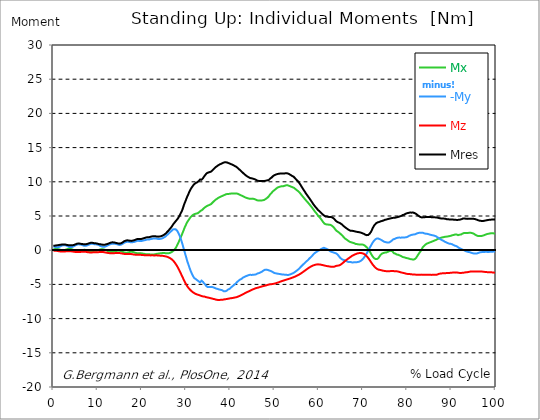
| Category |  Mx |  -My |  Mz |  Mres |
|---|---|---|---|---|
| 0.0 | 0.11 | 0.56 | -0.1 | 0.65 |
| 0.167348456675344 | 0.14 | 0.52 | -0.09 | 0.66 |
| 0.334696913350688 | 0.17 | 0.49 | -0.08 | 0.67 |
| 0.5020453700260321 | 0.18 | 0.46 | -0.09 | 0.69 |
| 0.669393826701376 | 0.18 | 0.43 | -0.09 | 0.7 |
| 0.83674228337672 | 0.19 | 0.42 | -0.1 | 0.7 |
| 1.0040907400520642 | 0.17 | 0.44 | -0.12 | 0.73 |
| 1.1621420602454444 | 0.15 | 0.46 | -0.14 | 0.76 |
| 1.3294905169207885 | 0.12 | 0.49 | -0.16 | 0.77 |
| 1.4968389735961325 | 0.08 | 0.55 | -0.18 | 0.78 |
| 1.6641874302714765 | 0.04 | 0.6 | -0.19 | 0.8 |
| 1.8315358869468206 | 0.01 | 0.65 | -0.2 | 0.82 |
| 1.9988843436221646 | -0.02 | 0.69 | -0.2 | 0.84 |
| 2.1662328002975086 | -0.02 | 0.71 | -0.2 | 0.85 |
| 2.333581256972853 | -0.01 | 0.73 | -0.2 | 0.85 |
| 2.5009297136481967 | 0.02 | 0.72 | -0.19 | 0.84 |
| 2.6682781703235405 | 0.05 | 0.72 | -0.18 | 0.83 |
| 2.8356266269988843 | 0.08 | 0.7 | -0.17 | 0.81 |
| 3.002975083674229 | 0.12 | 0.66 | -0.16 | 0.78 |
| 3.1703235403495724 | 0.16 | 0.62 | -0.15 | 0.76 |
| 3.337671997024917 | 0.19 | 0.55 | -0.15 | 0.74 |
| 3.4957233172182973 | 0.21 | 0.5 | -0.14 | 0.74 |
| 3.663071773893641 | 0.21 | 0.46 | -0.15 | 0.73 |
| 3.8304202305689854 | 0.2 | 0.44 | -0.15 | 0.72 |
| 3.997768687244329 | 0.17 | 0.45 | -0.16 | 0.72 |
| 4.165117143919673 | 0.14 | 0.47 | -0.18 | 0.72 |
| 4.332465600595017 | 0.1 | 0.49 | -0.19 | 0.73 |
| 4.499814057270361 | 0.05 | 0.54 | -0.21 | 0.75 |
| 4.667162513945706 | 0 | 0.59 | -0.23 | 0.77 |
| 4.834510970621049 | -0.06 | 0.65 | -0.24 | 0.82 |
| 5.001859427296393 | -0.11 | 0.72 | -0.26 | 0.86 |
| 5.169207883971737 | -0.14 | 0.76 | -0.27 | 0.91 |
| 5.336556340647081 | -0.16 | 0.81 | -0.28 | 0.95 |
| 5.503904797322425 | -0.17 | 0.84 | -0.28 | 0.97 |
| 5.671253253997769 | -0.16 | 0.86 | -0.27 | 0.98 |
| 5.82930457419115 | -0.13 | 0.85 | -0.27 | 0.97 |
| 5.996653030866494 | -0.1 | 0.84 | -0.26 | 0.96 |
| 6.164001487541838 | -0.07 | 0.82 | -0.25 | 0.94 |
| 6.331349944217181 | -0.03 | 0.8 | -0.24 | 0.92 |
| 6.498698400892526 | 0 | 0.76 | -0.23 | 0.9 |
| 6.66604685756787 | 0.03 | 0.71 | -0.22 | 0.89 |
| 6.833395314243213 | 0.05 | 0.67 | -0.22 | 0.87 |
| 7.000743770918558 | 0.06 | 0.64 | -0.22 | 0.85 |
| 7.168092227593902 | 0.06 | 0.63 | -0.23 | 0.85 |
| 7.335440684269246 | 0.04 | 0.64 | -0.24 | 0.87 |
| 7.50278914094459 | 0 | 0.67 | -0.26 | 0.89 |
| 7.6701375976199335 | -0.05 | 0.71 | -0.28 | 0.92 |
| 7.837486054295278 | -0.1 | 0.75 | -0.29 | 0.95 |
| 7.995537374488658 | -0.14 | 0.8 | -0.31 | 0.99 |
| 8.162885831164003 | -0.18 | 0.86 | -0.32 | 1.03 |
| 8.330234287839346 | -0.21 | 0.9 | -0.33 | 1.07 |
| 8.49758274451469 | -0.21 | 0.93 | -0.33 | 1.09 |
| 8.664931201190035 | -0.19 | 0.94 | -0.33 | 1.09 |
| 8.832279657865378 | -0.17 | 0.94 | -0.32 | 1.09 |
| 8.999628114540721 | -0.14 | 0.92 | -0.31 | 1.06 |
| 9.166976571216066 | -0.1 | 0.89 | -0.3 | 1.03 |
| 9.334325027891412 | -0.08 | 0.86 | -0.3 | 1 |
| 9.501673484566755 | -0.1 | 0.86 | -0.31 | 1 |
| 9.669021941242098 | -0.1 | 0.86 | -0.31 | 1 |
| 9.836370397917442 | -0.06 | 0.84 | -0.3 | 0.97 |
| 10.003718854592787 | -0.03 | 0.81 | -0.29 | 0.95 |
| 10.17106731126813 | 0.01 | 0.77 | -0.29 | 0.92 |
| 10.329118631461512 | 0.05 | 0.73 | -0.28 | 0.89 |
| 10.496467088136853 | 0.09 | 0.67 | -0.27 | 0.87 |
| 10.663815544812199 | 0.12 | 0.61 | -0.26 | 0.86 |
| 10.831164001487544 | 0.12 | 0.57 | -0.27 | 0.84 |
| 10.998512458162887 | 0.13 | 0.53 | -0.27 | 0.82 |
| 11.16586091483823 | 0.13 | 0.5 | -0.27 | 0.81 |
| 11.333209371513574 | 0.12 | 0.49 | -0.28 | 0.8 |
| 11.50055782818892 | 0.09 | 0.49 | -0.3 | 0.8 |
| 11.667906284864264 | 0.05 | 0.52 | -0.32 | 0.81 |
| 11.835254741539607 | 0.01 | 0.56 | -0.34 | 0.84 |
| 12.00260319821495 | -0.03 | 0.6 | -0.36 | 0.87 |
| 12.169951654890292 | -0.08 | 0.65 | -0.38 | 0.9 |
| 12.337300111565641 | -0.14 | 0.71 | -0.4 | 0.93 |
| 12.504648568240984 | -0.2 | 0.77 | -0.42 | 0.98 |
| 12.662699888434362 | -0.24 | 0.83 | -0.43 | 1.03 |
| 12.830048345109708 | -0.26 | 0.87 | -0.44 | 1.07 |
| 12.997396801785053 | -0.28 | 0.91 | -0.45 | 1.11 |
| 13.164745258460396 | -0.28 | 0.94 | -0.45 | 1.14 |
| 13.33209371513574 | -0.28 | 0.95 | -0.45 | 1.15 |
| 13.499442171811083 | -0.26 | 0.96 | -0.45 | 1.15 |
| 13.666790628486426 | -0.23 | 0.95 | -0.44 | 1.14 |
| 13.834139085161771 | -0.2 | 0.94 | -0.43 | 1.12 |
| 14.001487541837117 | -0.17 | 0.93 | -0.42 | 1.09 |
| 14.16883599851246 | -0.13 | 0.91 | -0.41 | 1.07 |
| 14.336184455187803 | -0.11 | 0.88 | -0.4 | 1.04 |
| 14.503532911863147 | -0.09 | 0.85 | -0.4 | 1.01 |
| 14.670881368538492 | -0.08 | 0.81 | -0.4 | 0.98 |
| 14.828932688731873 | -0.08 | 0.78 | -0.41 | 0.97 |
| 14.996281145407215 | -0.09 | 0.77 | -0.42 | 0.96 |
| 15.163629602082558 | -0.11 | 0.78 | -0.43 | 0.98 |
| 15.330978058757903 | -0.14 | 0.82 | -0.45 | 1.02 |
| 15.498326515433247 | -0.18 | 0.87 | -0.48 | 1.07 |
| 15.665674972108594 | -0.24 | 0.94 | -0.5 | 1.14 |
| 15.833023428783937 | -0.29 | 1.01 | -0.52 | 1.23 |
| 16.00037188545928 | -0.33 | 1.08 | -0.54 | 1.3 |
| 16.167720342134626 | -0.35 | 1.13 | -0.55 | 1.35 |
| 16.335068798809967 | -0.36 | 1.17 | -0.56 | 1.39 |
| 16.502417255485312 | -0.37 | 1.2 | -0.56 | 1.42 |
| 16.669765712160658 | -0.36 | 1.22 | -0.56 | 1.44 |
| 16.837114168836 | -0.34 | 1.23 | -0.56 | 1.44 |
| 17.004462625511344 | -0.31 | 1.22 | -0.56 | 1.43 |
| 17.16251394570472 | -0.28 | 1.21 | -0.56 | 1.41 |
| 17.32986240238007 | -0.25 | 1.18 | -0.56 | 1.38 |
| 17.497210859055414 | -0.23 | 1.15 | -0.56 | 1.35 |
| 17.664559315730756 | -0.22 | 1.16 | -0.57 | 1.36 |
| 17.8319077724061 | -0.24 | 1.17 | -0.59 | 1.38 |
| 17.999256229081443 | -0.26 | 1.18 | -0.61 | 1.41 |
| 18.166604685756788 | -0.29 | 1.2 | -0.62 | 1.43 |
| 18.333953142432133 | -0.33 | 1.22 | -0.64 | 1.47 |
| 18.501301599107478 | -0.38 | 1.26 | -0.66 | 1.52 |
| 18.668650055782823 | -0.41 | 1.3 | -0.67 | 1.56 |
| 18.835998512458165 | -0.44 | 1.34 | -0.67 | 1.61 |
| 19.00334696913351 | -0.45 | 1.37 | -0.67 | 1.64 |
| 19.170695425808855 | -0.44 | 1.38 | -0.67 | 1.65 |
| 19.338043882484197 | -0.43 | 1.36 | -0.67 | 1.63 |
| 19.496095202677576 | -0.43 | 1.36 | -0.67 | 1.63 |
| 19.66344365935292 | -0.43 | 1.34 | -0.67 | 1.62 |
| 19.830792116028263 | -0.44 | 1.33 | -0.68 | 1.61 |
| 19.998140572703612 | -0.48 | 1.36 | -0.7 | 1.66 |
| 20.165489029378953 | -0.5 | 1.4 | -0.71 | 1.7 |
| 20.3328374860543 | -0.51 | 1.42 | -0.71 | 1.73 |
| 20.500185942729644 | -0.51 | 1.42 | -0.72 | 1.74 |
| 20.667534399404985 | -0.55 | 1.46 | -0.74 | 1.79 |
| 20.83488285608033 | -0.58 | 1.5 | -0.74 | 1.84 |
| 21.002231312755672 | -0.6 | 1.53 | -0.75 | 1.87 |
| 21.16957976943102 | -0.6 | 1.56 | -0.75 | 1.89 |
| 21.336928226106362 | -0.59 | 1.57 | -0.75 | 1.9 |
| 21.504276682781704 | -0.58 | 1.57 | -0.75 | 1.89 |
| 21.67162513945705 | -0.59 | 1.57 | -0.75 | 1.9 |
| 21.82967645965043 | -0.61 | 1.6 | -0.76 | 1.93 |
| 21.997024916325774 | -0.63 | 1.63 | -0.76 | 1.97 |
| 22.16437337300112 | -0.63 | 1.65 | -0.76 | 2 |
| 22.33172182967646 | -0.63 | 1.67 | -0.75 | 2.02 |
| 22.499070286351806 | -0.63 | 1.69 | -0.75 | 2.03 |
| 22.666418743027148 | -0.62 | 1.71 | -0.76 | 2.04 |
| 22.833767199702496 | -0.61 | 1.73 | -0.76 | 2.06 |
| 23.00111565637784 | -0.6 | 1.72 | -0.76 | 2.05 |
| 23.168464113053183 | -0.59 | 1.72 | -0.76 | 2.04 |
| 23.335812569728528 | -0.54 | 1.69 | -0.75 | 2 |
| 23.50316102640387 | -0.52 | 1.66 | -0.76 | 1.97 |
| 23.670509483079215 | -0.51 | 1.64 | -0.78 | 1.98 |
| 23.83785793975456 | -0.49 | 1.64 | -0.79 | 1.99 |
| 23.995909259947936 | -0.47 | 1.64 | -0.79 | 2 |
| 24.163257716623285 | -0.45 | 1.65 | -0.8 | 2.01 |
| 24.330606173298627 | -0.44 | 1.67 | -0.81 | 2.04 |
| 24.49795462997397 | -0.43 | 1.71 | -0.82 | 2.08 |
| 24.665303086649313 | -0.42 | 1.75 | -0.82 | 2.12 |
| 24.83265154332466 | -0.42 | 1.8 | -0.84 | 2.18 |
| 25.0 | -0.42 | 1.86 | -0.85 | 2.24 |
| 25.167348456675345 | -0.43 | 1.92 | -0.87 | 2.31 |
| 25.334696913350694 | -0.43 | 2 | -0.9 | 2.4 |
| 25.502045370026035 | -0.44 | 2.09 | -0.93 | 2.5 |
| 25.669393826701377 | -0.45 | 2.2 | -0.95 | 2.62 |
| 25.836742283376722 | -0.45 | 2.29 | -0.99 | 2.72 |
| 26.004090740052067 | -0.45 | 2.39 | -1.03 | 2.84 |
| 26.17143919672741 | -0.43 | 2.49 | -1.09 | 2.95 |
| 26.329490516920792 | -0.41 | 2.61 | -1.14 | 3.1 |
| 26.49683897359613 | -0.36 | 2.71 | -1.2 | 3.22 |
| 26.66418743027148 | -0.3 | 2.79 | -1.28 | 3.36 |
| 26.831535886946828 | -0.23 | 2.91 | -1.37 | 3.52 |
| 26.998884343622166 | -0.16 | 3.02 | -1.47 | 3.69 |
| 27.166232800297514 | -0.07 | 3.08 | -1.59 | 3.85 |
| 27.333581256972852 | 0.05 | 3.08 | -1.71 | 3.97 |
| 27.5009297136482 | 0.18 | 3.07 | -1.85 | 4.11 |
| 27.668278170323543 | 0.33 | 3.05 | -2.01 | 4.25 |
| 27.835626626998888 | 0.51 | 2.97 | -2.18 | 4.38 |
| 28.002975083674233 | 0.73 | 2.83 | -2.36 | 4.52 |
| 28.170323540349575 | 0.95 | 2.65 | -2.55 | 4.64 |
| 28.33767199702492 | 1.19 | 2.42 | -2.75 | 4.82 |
| 28.50502045370026 | 1.43 | 2.2 | -2.96 | 5.02 |
| 28.663071773893645 | 1.69 | 1.9 | -3.19 | 5.24 |
| 28.830420230568986 | 1.94 | 1.61 | -3.42 | 5.46 |
| 28.99776868724433 | 2.19 | 1.28 | -3.65 | 5.64 |
| 29.165117143919673 | 2.46 | 0.93 | -3.88 | 5.9 |
| 29.33246560059502 | 2.72 | 0.54 | -4.11 | 6.23 |
| 29.499814057270367 | 3 | 0.16 | -4.34 | 6.56 |
| 29.66716251394571 | 3.28 | -0.23 | -4.56 | 6.86 |
| 29.834510970621054 | 3.52 | -0.6 | -4.77 | 7.11 |
| 30.00185942729639 | 3.75 | -0.96 | -4.97 | 7.39 |
| 30.169207883971744 | 3.98 | -1.36 | -5.16 | 7.68 |
| 30.33655634064708 | 4.18 | -1.72 | -5.32 | 7.93 |
| 30.50390479732243 | 4.33 | -2.02 | -5.47 | 8.16 |
| 30.671253253997772 | 4.49 | -2.33 | -5.61 | 8.42 |
| 30.829304574191156 | 4.65 | -2.66 | -5.73 | 8.65 |
| 30.996653030866494 | 4.81 | -2.96 | -5.84 | 8.87 |
| 31.164001487541842 | 4.93 | -3.22 | -5.94 | 9.05 |
| 31.331349944217187 | 5.03 | -3.45 | -6.03 | 9.21 |
| 31.498698400892525 | 5.12 | -3.68 | -6.12 | 9.37 |
| 31.666046857567874 | 5.2 | -3.88 | -6.2 | 9.51 |
| 31.833395314243212 | 5.26 | -4.05 | -6.27 | 9.65 |
| 32.00074377091856 | 5.3 | -4.1 | -6.34 | 9.73 |
| 32.1680922275939 | 5.35 | -4.21 | -6.39 | 9.81 |
| 32.33544068426925 | 5.36 | -4.3 | -6.43 | 9.86 |
| 32.50278914094459 | 5.38 | -4.38 | -6.47 | 9.92 |
| 32.670137597619934 | 5.41 | -4.45 | -6.5 | 9.99 |
| 32.83748605429528 | 5.49 | -4.54 | -6.54 | 10.09 |
| 33.004834510970625 | 5.59 | -4.62 | -6.57 | 10.2 |
| 33.162885831164004 | 5.71 | -4.7 | -6.61 | 10.33 |
| 33.33023428783935 | 5.77 | -4.56 | -6.65 | 10.31 |
| 33.497582744514695 | 5.82 | -4.45 | -6.7 | 10.31 |
| 33.664931201190036 | 5.89 | -4.45 | -6.74 | 10.37 |
| 33.83227965786538 | 6 | -4.63 | -6.76 | 10.53 |
| 33.99962811454073 | 6.12 | -4.78 | -6.77 | 10.7 |
| 34.16697657121607 | 6.22 | -4.9 | -6.78 | 10.84 |
| 34.33432502789141 | 6.29 | -5.01 | -6.83 | 10.98 |
| 34.50167348456676 | 6.36 | -5.17 | -6.86 | 11.12 |
| 34.6690219412421 | 6.44 | -5.31 | -6.89 | 11.25 |
| 34.83637039791744 | 6.51 | -5.38 | -6.91 | 11.33 |
| 35.00371885459279 | 6.54 | -5.38 | -6.93 | 11.35 |
| 35.17106731126814 | 6.59 | -5.38 | -6.95 | 11.39 |
| 35.338415767943474 | 6.64 | -5.38 | -6.98 | 11.42 |
| 35.49646708813686 | 6.68 | -5.38 | -7.01 | 11.45 |
| 35.6638155448122 | 6.75 | -5.36 | -7.03 | 11.5 |
| 35.831164001487544 | 6.86 | -5.36 | -7.06 | 11.58 |
| 35.998512458162885 | 6.97 | -5.41 | -7.09 | 11.69 |
| 36.165860914838234 | 7.07 | -5.43 | -7.12 | 11.79 |
| 36.333209371513576 | 7.18 | -5.5 | -7.14 | 11.92 |
| 36.50055782818892 | 7.28 | -5.53 | -7.17 | 12.02 |
| 36.667906284864266 | 7.37 | -5.58 | -7.21 | 12.13 |
| 36.83525474153961 | 7.44 | -5.61 | -7.24 | 12.21 |
| 37.002603198214956 | 7.51 | -5.63 | -7.26 | 12.28 |
| 37.1699516548903 | 7.6 | -5.67 | -7.27 | 12.37 |
| 37.337300111565646 | 7.67 | -5.7 | -7.28 | 12.44 |
| 37.50464856824098 | 7.73 | -5.74 | -7.27 | 12.51 |
| 37.66269988843437 | 7.78 | -5.76 | -7.27 | 12.56 |
| 37.83004834510971 | 7.83 | -5.79 | -7.26 | 12.61 |
| 37.99739680178505 | 7.88 | -5.82 | -7.25 | 12.65 |
| 38.16474525846039 | 7.93 | -5.85 | -7.25 | 12.7 |
| 38.33209371513574 | 7.97 | -5.94 | -7.22 | 12.76 |
| 38.49944217181109 | 8.01 | -5.99 | -7.21 | 12.8 |
| 38.666790628486424 | 8.07 | -6.01 | -7.19 | 12.84 |
| 38.83413908516178 | 8.12 | -6.01 | -7.17 | 12.86 |
| 39.001487541837115 | 8.17 | -5.98 | -7.16 | 12.86 |
| 39.16883599851246 | 8.2 | -5.93 | -7.14 | 12.85 |
| 39.336184455187805 | 8.22 | -5.85 | -7.12 | 12.81 |
| 39.503532911863154 | 8.24 | -5.75 | -7.1 | 12.76 |
| 39.670881368538495 | 8.23 | -5.72 | -7.07 | 12.72 |
| 39.83822982521384 | 8.25 | -5.66 | -7.05 | 12.69 |
| 39.996281145407224 | 8.26 | -5.55 | -7.03 | 12.63 |
| 40.163629602082565 | 8.28 | -5.45 | -7.02 | 12.58 |
| 40.33097805875791 | 8.3 | -5.36 | -7.01 | 12.54 |
| 40.498326515433256 | 8.31 | -5.27 | -6.99 | 12.5 |
| 40.6656749721086 | 8.3 | -5.19 | -6.97 | 12.44 |
| 40.83302342878393 | 8.3 | -5.1 | -6.95 | 12.38 |
| 41.00037188545929 | 8.29 | -5 | -6.93 | 12.32 |
| 41.16772034213463 | 8.3 | -4.91 | -6.9 | 12.27 |
| 41.33506879880997 | 8.29 | -4.8 | -6.88 | 12.2 |
| 41.50241725548531 | 8.28 | -4.68 | -6.85 | 12.12 |
| 41.66976571216066 | 8.26 | -4.58 | -6.81 | 12.04 |
| 41.837114168836 | 8.21 | -4.48 | -6.76 | 11.94 |
| 42.004462625511344 | 8.16 | -4.39 | -6.71 | 11.83 |
| 42.17181108218669 | 8.1 | -4.32 | -6.67 | 11.74 |
| 42.32986240238007 | 8.05 | -4.26 | -6.62 | 11.64 |
| 42.497210859055414 | 8 | -4.21 | -6.57 | 11.55 |
| 42.66455931573076 | 7.95 | -4.1 | -6.51 | 11.43 |
| 42.831907772406105 | 7.9 | -4.03 | -6.45 | 11.33 |
| 42.999256229081446 | 7.85 | -3.96 | -6.38 | 11.23 |
| 43.16660468575679 | 7.79 | -3.92 | -6.34 | 11.14 |
| 43.33395314243214 | 7.73 | -3.86 | -6.28 | 11.04 |
| 43.50130159910748 | 7.69 | -3.8 | -6.22 | 10.95 |
| 43.66865005578282 | 7.65 | -3.75 | -6.16 | 10.86 |
| 43.83599851245817 | 7.61 | -3.73 | -6.11 | 10.79 |
| 44.00334696913351 | 7.58 | -3.69 | -6.06 | 10.73 |
| 44.17069542580886 | 7.57 | -3.64 | -6.02 | 10.67 |
| 44.3380438824842 | 7.53 | -3.6 | -5.96 | 10.6 |
| 44.49609520267758 | 7.51 | -3.59 | -5.91 | 10.54 |
| 44.66344365935292 | 7.53 | -3.59 | -5.86 | 10.52 |
| 44.83079211602827 | 7.55 | -3.62 | -5.81 | 10.52 |
| 44.99814057270361 | 7.54 | -3.62 | -5.76 | 10.49 |
| 45.16548902937895 | 7.54 | -3.58 | -5.71 | 10.46 |
| 45.332837486054295 | 7.5 | -3.58 | -5.67 | 10.42 |
| 45.500185942729644 | 7.45 | -3.57 | -5.63 | 10.38 |
| 45.66753439940499 | 7.42 | -3.56 | -5.58 | 10.34 |
| 45.83488285608033 | 7.37 | -3.53 | -5.54 | 10.28 |
| 46.00223131275568 | 7.31 | -3.46 | -5.51 | 10.21 |
| 46.16957976943102 | 7.27 | -3.4 | -5.49 | 10.16 |
| 46.336928226106366 | 7.26 | -3.38 | -5.46 | 10.14 |
| 46.50427668278171 | 7.26 | -3.35 | -5.43 | 10.13 |
| 46.671625139457056 | 7.25 | -3.29 | -5.4 | 10.11 |
| 46.829676459650436 | 7.26 | -3.25 | -5.36 | 10.11 |
| 46.99702491632577 | 7.27 | -3.22 | -5.32 | 10.11 |
| 47.16437337300112 | 7.28 | -3.14 | -5.29 | 10.1 |
| 47.33172182967646 | 7.29 | -3.05 | -5.26 | 10.1 |
| 47.49907028635181 | 7.31 | -2.98 | -5.24 | 10.1 |
| 47.66641874302716 | 7.35 | -2.91 | -5.22 | 10.11 |
| 47.83376719970249 | 7.41 | -2.86 | -5.19 | 10.14 |
| 48.001115656377834 | 7.48 | -2.85 | -5.16 | 10.16 |
| 48.16846411305319 | 7.56 | -2.84 | -5.13 | 10.18 |
| 48.33581256972853 | 7.64 | -2.85 | -5.1 | 10.21 |
| 48.50316102640387 | 7.74 | -2.89 | -5.06 | 10.21 |
| 48.67050948307921 | 7.84 | -2.94 | -5.01 | 10.24 |
| 48.837857939754564 | 7.99 | -2.97 | -5 | 10.34 |
| 49.005206396429905 | 8.15 | -2.99 | -5 | 10.46 |
| 49.163257716623285 | 8.26 | -3.05 | -4.98 | 10.53 |
| 49.33060617329863 | 8.38 | -3.1 | -4.96 | 10.62 |
| 49.49795462997397 | 8.5 | -3.15 | -4.95 | 10.72 |
| 49.66530308664932 | 8.62 | -3.22 | -4.93 | 10.83 |
| 49.832651543324666 | 8.73 | -3.29 | -4.91 | 10.91 |
| 50.0 | 8.8 | -3.34 | -4.89 | 10.97 |
| 50.16734845667534 | 8.89 | -3.37 | -4.86 | 11.02 |
| 50.33469691335069 | 8.97 | -3.4 | -4.83 | 11.07 |
| 50.50204537002604 | 9.06 | -3.4 | -4.79 | 11.1 |
| 50.66939382670139 | 9.15 | -3.42 | -4.74 | 11.14 |
| 50.836742283376715 | 9.21 | -3.45 | -4.71 | 11.17 |
| 51.00409074005207 | 9.24 | -3.47 | -4.67 | 11.18 |
| 51.17143919672741 | 9.27 | -3.48 | -4.64 | 11.19 |
| 51.32949051692079 | 9.31 | -3.5 | -4.6 | 11.21 |
| 51.496838973596134 | 9.34 | -3.52 | -4.55 | 11.22 |
| 51.66418743027148 | 9.35 | -3.54 | -4.52 | 11.21 |
| 51.831535886946824 | 9.35 | -3.57 | -4.48 | 11.21 |
| 51.99888434362217 | 9.36 | -3.57 | -4.45 | 11.2 |
| 52.16623280029752 | 9.39 | -3.57 | -4.41 | 11.21 |
| 52.33358125697285 | 9.43 | -3.57 | -4.37 | 11.23 |
| 52.5009297136482 | 9.46 | -3.58 | -4.34 | 11.24 |
| 52.668278170323546 | 9.5 | -3.59 | -4.31 | 11.26 |
| 52.835626626998895 | 9.52 | -3.61 | -4.27 | 11.27 |
| 53.00297508367424 | 9.48 | -3.62 | -4.24 | 11.22 |
| 53.17032354034958 | 9.44 | -3.61 | -4.21 | 11.17 |
| 53.33767199702492 | 9.4 | -3.59 | -4.18 | 11.12 |
| 53.50502045370027 | 9.37 | -3.55 | -4.14 | 11.07 |
| 53.663071773893655 | 9.32 | -3.51 | -4.1 | 10.99 |
| 53.83042023056899 | 9.26 | -3.46 | -4.06 | 10.91 |
| 53.99776868724433 | 9.22 | -3.43 | -4.02 | 10.85 |
| 54.16511714391967 | 9.18 | -3.37 | -3.98 | 10.79 |
| 54.33246560059503 | 9.15 | -3.31 | -3.94 | 10.74 |
| 54.49981405727037 | 9.07 | -3.24 | -3.9 | 10.64 |
| 54.667162513945705 | 8.98 | -3.16 | -3.85 | 10.51 |
| 54.834510970621054 | 8.89 | -3.08 | -3.8 | 10.39 |
| 55.0018594272964 | 8.8 | -3 | -3.74 | 10.27 |
| 55.169207883971744 | 8.72 | -2.92 | -3.69 | 10.16 |
| 55.336556340647086 | 8.64 | -2.83 | -3.64 | 10.05 |
| 55.50390479732243 | 8.54 | -2.74 | -3.58 | 9.92 |
| 55.671253253997776 | 8.43 | -2.62 | -3.52 | 9.77 |
| 55.83860171067312 | 8.3 | -2.51 | -3.46 | 9.6 |
| 55.9966530308665 | 8.16 | -2.41 | -3.39 | 9.43 |
| 56.16400148754184 | 8.03 | -2.29 | -3.31 | 9.25 |
| 56.33134994421718 | 7.89 | -2.2 | -3.23 | 9.08 |
| 56.498698400892536 | 7.75 | -2.07 | -3.16 | 8.9 |
| 56.66604685756788 | 7.63 | -1.97 | -3.08 | 8.74 |
| 56.83339531424321 | 7.51 | -1.88 | -3 | 8.58 |
| 57.00074377091856 | 7.37 | -1.77 | -2.93 | 8.41 |
| 57.16809222759391 | 7.24 | -1.66 | -2.85 | 8.24 |
| 57.33544068426925 | 7.12 | -1.56 | -2.77 | 8.09 |
| 57.5027891409446 | 7.02 | -1.48 | -2.69 | 7.96 |
| 57.670137597619934 | 6.89 | -1.36 | -2.62 | 7.79 |
| 57.83748605429528 | 6.76 | -1.25 | -2.55 | 7.64 |
| 58.004834510970625 | 6.62 | -1.15 | -2.48 | 7.48 |
| 58.16288583116401 | 6.49 | -1.04 | -2.41 | 7.32 |
| 58.330234287839346 | 6.36 | -0.94 | -2.35 | 7.17 |
| 58.497582744514695 | 6.22 | -0.83 | -2.3 | 7.01 |
| 58.66493120119004 | 6.07 | -0.71 | -2.25 | 6.84 |
| 58.832279657865385 | 5.92 | -0.58 | -2.21 | 6.68 |
| 58.999628114540734 | 5.78 | -0.48 | -2.17 | 6.55 |
| 59.16697657121607 | 5.63 | -0.39 | -2.14 | 6.4 |
| 59.33432502789142 | 5.49 | -0.31 | -2.11 | 6.26 |
| 59.50167348456676 | 5.37 | -0.25 | -2.08 | 6.15 |
| 59.66902194124211 | 5.22 | -0.17 | -2.07 | 6.01 |
| 59.83637039791745 | 5.06 | -0.1 | -2.07 | 5.88 |
| 60.00371885459278 | 4.93 | -0.04 | -2.07 | 5.77 |
| 60.17106731126813 | 4.84 | 0 | -2.08 | 5.7 |
| 60.33841576794349 | 4.71 | 0.08 | -2.1 | 5.6 |
| 60.49646708813685 | 4.57 | 0.15 | -2.12 | 5.49 |
| 60.6638155448122 | 4.42 | 0.21 | -2.14 | 5.39 |
| 60.831164001487544 | 4.26 | 0.27 | -2.17 | 5.27 |
| 60.99851245816289 | 4.11 | 0.32 | -2.19 | 5.17 |
| 61.16586091483824 | 3.98 | 0.35 | -2.22 | 5.09 |
| 61.333209371513576 | 3.86 | 0.33 | -2.25 | 5.01 |
| 61.50055782818892 | 3.8 | 0.27 | -2.27 | 4.94 |
| 61.667906284864266 | 3.78 | 0.21 | -2.29 | 4.92 |
| 61.835254741539615 | 3.77 | 0.17 | -2.32 | 4.91 |
| 62.002603198214956 | 3.75 | 0.13 | -2.33 | 4.88 |
| 62.16995165489029 | 3.74 | 0.06 | -2.35 | 4.87 |
| 62.33730011156564 | 3.73 | -0.02 | -2.37 | 4.86 |
| 62.504648568240995 | 3.72 | -0.11 | -2.39 | 4.86 |
| 62.67199702491633 | 3.7 | -0.18 | -2.41 | 4.87 |
| 62.83004834510971 | 3.63 | -0.23 | -2.42 | 4.84 |
| 62.99739680178505 | 3.57 | -0.27 | -2.43 | 4.81 |
| 63.1647452584604 | 3.49 | -0.3 | -2.43 | 4.75 |
| 63.33209371513575 | 3.39 | -0.35 | -2.42 | 4.68 |
| 63.4994421718111 | 3.26 | -0.37 | -2.41 | 4.58 |
| 63.666790628486424 | 3.11 | -0.4 | -2.36 | 4.44 |
| 63.83413908516177 | 2.97 | -0.44 | -2.32 | 4.32 |
| 64.00148754183712 | 2.84 | -0.5 | -2.28 | 4.22 |
| 64.16883599851248 | 2.76 | -0.57 | -2.26 | 4.15 |
| 64.3361844551878 | 2.7 | -0.69 | -2.26 | 4.09 |
| 64.50353291186315 | 2.63 | -0.82 | -2.25 | 4.05 |
| 64.6708813685385 | 2.54 | -0.96 | -2.22 | 4 |
| 64.83822982521384 | 2.44 | -1.1 | -2.16 | 3.95 |
| 65.00557828188919 | 2.34 | -1.22 | -2.09 | 3.89 |
| 65.16362960208257 | 2.24 | -1.3 | -2.01 | 3.81 |
| 65.3309780587579 | 2.14 | -1.36 | -1.93 | 3.71 |
| 65.49832651543326 | 2.03 | -1.4 | -1.84 | 3.6 |
| 65.6656749721086 | 1.9 | -1.44 | -1.73 | 3.51 |
| 65.83302342878395 | 1.78 | -1.46 | -1.64 | 3.42 |
| 66.00037188545929 | 1.68 | -1.47 | -1.56 | 3.33 |
| 66.16772034213463 | 1.6 | -1.53 | -1.48 | 3.25 |
| 66.33506879880998 | 1.54 | -1.64 | -1.39 | 3.17 |
| 66.50241725548531 | 1.46 | -1.69 | -1.31 | 3.1 |
| 66.66976571216065 | 1.38 | -1.72 | -1.23 | 3.03 |
| 66.83711416883601 | 1.3 | -1.73 | -1.15 | 2.96 |
| 67.00446262551135 | 1.23 | -1.71 | -1.08 | 2.89 |
| 67.1718110821867 | 1.17 | -1.72 | -1 | 2.85 |
| 67.32986240238007 | 1.16 | -1.75 | -0.92 | 2.83 |
| 67.49721085905541 | 1.14 | -1.78 | -0.84 | 2.84 |
| 67.66455931573076 | 1.09 | -1.78 | -0.79 | 2.84 |
| 67.83190777240611 | 1.04 | -1.78 | -0.73 | 2.81 |
| 67.99925622908145 | 1.03 | -1.78 | -0.67 | 2.79 |
| 68.16660468575678 | 0.98 | -1.77 | -0.62 | 2.75 |
| 68.33395314243214 | 0.92 | -1.75 | -0.57 | 2.71 |
| 68.50130159910749 | 0.89 | -1.76 | -0.53 | 2.7 |
| 68.66865005578282 | 0.89 | -1.75 | -0.49 | 2.7 |
| 68.83599851245816 | 0.85 | -1.73 | -0.46 | 2.66 |
| 69.00334696913352 | 0.85 | -1.71 | -0.44 | 2.65 |
| 69.17069542580886 | 0.84 | -1.67 | -0.42 | 2.63 |
| 69.3380438824842 | 0.84 | -1.62 | -0.41 | 2.61 |
| 69.50539233915956 | 0.85 | -1.56 | -0.41 | 2.58 |
| 69.66344365935292 | 0.85 | -1.48 | -0.43 | 2.55 |
| 69.83079211602826 | 0.83 | -1.39 | -0.44 | 2.49 |
| 69.99814057270362 | 0.81 | -1.26 | -0.48 | 2.45 |
| 70.16548902937896 | 0.77 | -1.14 | -0.52 | 2.41 |
| 70.33283748605429 | 0.71 | -1.01 | -0.58 | 2.35 |
| 70.50018594272964 | 0.63 | -0.84 | -0.66 | 2.28 |
| 70.667534399405 | 0.54 | -0.68 | -0.75 | 2.22 |
| 70.83488285608033 | 0.44 | -0.5 | -0.86 | 2.2 |
| 71.00223131275568 | 0.33 | -0.31 | -0.99 | 2.2 |
| 71.16957976943102 | 0.19 | -0.1 | -1.12 | 2.22 |
| 71.33692822610637 | 0.03 | 0.1 | -1.26 | 2.3 |
| 71.50427668278171 | -0.14 | 0.3 | -1.42 | 2.4 |
| 71.67162513945706 | -0.33 | 0.51 | -1.58 | 2.51 |
| 71.8389735961324 | -0.54 | 0.7 | -1.75 | 2.7 |
| 71.99702491632577 | -0.71 | 0.89 | -1.9 | 2.91 |
| 72.16437337300113 | -0.89 | 1.08 | -2.07 | 3.17 |
| 72.33172182967647 | -1.03 | 1.24 | -2.21 | 3.38 |
| 72.49907028635181 | -1.15 | 1.39 | -2.33 | 3.57 |
| 72.66641874302715 | -1.23 | 1.51 | -2.45 | 3.72 |
| 72.8337671997025 | -1.29 | 1.61 | -2.56 | 3.85 |
| 73.00111565637783 | -1.31 | 1.67 | -2.65 | 3.95 |
| 73.16846411305319 | -1.3 | 1.71 | -2.73 | 4.02 |
| 73.33581256972853 | -1.27 | 1.72 | -2.79 | 4.07 |
| 73.50316102640387 | -1.16 | 1.7 | -2.84 | 4.1 |
| 73.67050948307921 | -1.02 | 1.67 | -2.88 | 4.13 |
| 73.83785793975457 | -0.82 | 1.6 | -2.88 | 4.18 |
| 74.00520639642991 | -0.67 | 1.54 | -2.89 | 4.22 |
| 74.16325771662328 | -0.57 | 1.49 | -2.93 | 4.25 |
| 74.33060617329863 | -0.49 | 1.44 | -2.96 | 4.28 |
| 74.49795462997398 | -0.44 | 1.36 | -2.99 | 4.31 |
| 74.66530308664932 | -0.4 | 1.29 | -3.01 | 4.35 |
| 74.83265154332466 | -0.36 | 1.23 | -3.03 | 4.4 |
| 75.00000000000001 | -0.35 | 1.19 | -3.04 | 4.45 |
| 75.16734845667534 | -0.38 | 1.17 | -3.06 | 4.48 |
| 75.3346969133507 | -0.32 | 1.14 | -3.08 | 4.49 |
| 75.50204537002605 | -0.27 | 1.12 | -3.08 | 4.53 |
| 75.66939382670138 | -0.22 | 1.09 | -3.08 | 4.56 |
| 75.83674228337672 | -0.18 | 1.11 | -3.07 | 4.59 |
| 76.00409074005208 | -0.13 | 1.14 | -3.07 | 4.61 |
| 76.17143919672742 | -0.1 | 1.22 | -3.06 | 4.64 |
| 76.33878765340276 | -0.08 | 1.3 | -3.05 | 4.67 |
| 76.49683897359614 | -0.11 | 1.39 | -3.04 | 4.69 |
| 76.66418743027148 | -0.17 | 1.49 | -3.04 | 4.71 |
| 76.83153588694682 | -0.29 | 1.58 | -3.04 | 4.73 |
| 76.99888434362218 | -0.44 | 1.67 | -3.05 | 4.75 |
| 77.16623280029752 | -0.44 | 1.65 | -3.08 | 4.73 |
| 77.33358125697285 | -0.5 | 1.7 | -3.08 | 4.76 |
| 77.5009297136482 | -0.55 | 1.76 | -3.08 | 4.79 |
| 77.66827817032356 | -0.64 | 1.8 | -3.09 | 4.82 |
| 77.83562662699889 | -0.69 | 1.82 | -3.1 | 4.85 |
| 78.00297508367423 | -0.67 | 1.8 | -3.13 | 4.87 |
| 78.17032354034959 | -0.72 | 1.85 | -3.16 | 4.92 |
| 78.33767199702493 | -0.77 | 1.86 | -3.2 | 4.94 |
| 78.50502045370027 | -0.8 | 1.83 | -3.23 | 4.97 |
| 78.67236891037561 | -0.87 | 1.83 | -3.25 | 5.01 |
| 78.83042023056899 | -0.94 | 1.85 | -3.28 | 5.07 |
| 78.99776868724433 | -1 | 1.88 | -3.3 | 5.14 |
| 79.16511714391969 | -1.02 | 1.87 | -3.33 | 5.16 |
| 79.33246560059503 | -1.04 | 1.87 | -3.35 | 5.2 |
| 79.49981405727036 | -1.07 | 1.87 | -3.38 | 5.25 |
| 79.66716251394571 | -1.12 | 1.88 | -3.43 | 5.33 |
| 79.83451097062107 | -1.16 | 1.9 | -3.45 | 5.38 |
| 80.00185942729641 | -1.17 | 1.93 | -3.46 | 5.41 |
| 80.16920788397174 | -1.2 | 1.99 | -3.47 | 5.44 |
| 80.33655634064709 | -1.21 | 2.05 | -3.48 | 5.46 |
| 80.50390479732243 | -1.28 | 2.12 | -3.48 | 5.49 |
| 80.67125325399778 | -1.3 | 2.17 | -3.5 | 5.51 |
| 80.83860171067312 | -1.3 | 2.2 | -3.52 | 5.49 |
| 80.99665303086651 | -1.32 | 2.24 | -3.53 | 5.49 |
| 81.16400148754184 | -1.38 | 2.27 | -3.54 | 5.51 |
| 81.3313499442172 | -1.38 | 2.29 | -3.56 | 5.5 |
| 81.49869840089255 | -1.38 | 2.29 | -3.56 | 5.48 |
| 81.66604685756786 | -1.33 | 2.3 | -3.56 | 5.43 |
| 81.83339531424322 | -1.24 | 2.34 | -3.57 | 5.37 |
| 82.00074377091858 | -1.14 | 2.4 | -3.58 | 5.31 |
| 82.16809222759392 | -1.01 | 2.45 | -3.58 | 5.23 |
| 82.33544068426926 | -0.81 | 2.48 | -3.58 | 5.14 |
| 82.50278914094459 | -0.64 | 2.51 | -3.58 | 5.06 |
| 82.67013759761994 | -0.47 | 2.54 | -3.58 | 4.98 |
| 82.83748605429528 | -0.35 | 2.56 | -3.58 | 4.91 |
| 83.00483451097062 | -0.18 | 2.56 | -3.58 | 4.85 |
| 83.17218296764597 | 0 | 2.55 | -3.57 | 4.8 |
| 83.33023428783935 | 0.2 | 2.56 | -3.58 | 4.79 |
| 83.4975827445147 | 0.41 | 2.56 | -3.59 | 4.82 |
| 83.66493120119004 | 0.52 | 2.53 | -3.58 | 4.82 |
| 83.83227965786537 | 0.63 | 2.47 | -3.58 | 4.83 |
| 83.99962811454073 | 0.74 | 2.43 | -3.58 | 4.83 |
| 84.16697657121607 | 0.84 | 2.41 | -3.58 | 4.85 |
| 84.33432502789142 | 0.91 | 2.4 | -3.58 | 4.86 |
| 84.50167348456677 | 0.98 | 2.4 | -3.58 | 4.87 |
| 84.6690219412421 | 1.02 | 2.37 | -3.59 | 4.87 |
| 84.83637039791745 | 1.06 | 2.34 | -3.6 | 4.86 |
| 85.0037188545928 | 1.11 | 2.3 | -3.6 | 4.85 |
| 85.17106731126813 | 1.15 | 2.27 | -3.6 | 4.85 |
| 85.33841576794349 | 1.2 | 2.23 | -3.61 | 4.84 |
| 85.50576422461883 | 1.23 | 2.22 | -3.61 | 4.83 |
| 85.66381554481221 | 1.27 | 2.2 | -3.61 | 4.82 |
| 85.83116400148755 | 1.32 | 2.17 | -3.6 | 4.82 |
| 85.99851245816289 | 1.37 | 2.15 | -3.59 | 4.81 |
| 86.16586091483823 | 1.41 | 2.12 | -3.6 | 4.81 |
| 86.33320937151358 | 1.44 | 2.09 | -3.6 | 4.8 |
| 86.50055782818893 | 1.49 | 2.04 | -3.59 | 4.79 |
| 86.66790628486427 | 1.55 | 1.96 | -3.58 | 4.78 |
| 86.83525474153961 | 1.61 | 1.89 | -3.56 | 4.76 |
| 87.00260319821496 | 1.67 | 1.83 | -3.51 | 4.74 |
| 87.16995165489031 | 1.72 | 1.77 | -3.46 | 4.7 |
| 87.33730011156564 | 1.74 | 1.7 | -3.44 | 4.68 |
| 87.504648568241 | 1.79 | 1.61 | -3.42 | 4.66 |
| 87.67199702491634 | 1.83 | 1.54 | -3.4 | 4.64 |
| 87.83004834510972 | 1.86 | 1.48 | -3.39 | 4.63 |
| 87.99739680178506 | 1.88 | 1.43 | -3.39 | 4.62 |
| 88.1647452584604 | 1.9 | 1.38 | -3.38 | 4.62 |
| 88.33209371513574 | 1.92 | 1.31 | -3.37 | 4.62 |
| 88.49944217181108 | 1.95 | 1.24 | -3.36 | 4.6 |
| 88.66679062848644 | 1.96 | 1.2 | -3.35 | 4.59 |
| 88.83413908516178 | 1.98 | 1.15 | -3.35 | 4.56 |
| 89.00148754183712 | 2 | 1.09 | -3.34 | 4.52 |
| 89.16883599851246 | 2.01 | 1.04 | -3.33 | 4.52 |
| 89.33618445518782 | 2.02 | 1.02 | -3.33 | 4.52 |
| 89.50353291186315 | 2.05 | 0.96 | -3.32 | 4.49 |
| 89.6708813685385 | 2.07 | 0.94 | -3.31 | 4.48 |
| 89.83822982521386 | 2.1 | 0.93 | -3.31 | 4.48 |
| 90.00557828188919 | 2.14 | 0.91 | -3.3 | 4.48 |
| 90.16362960208257 | 2.18 | 0.87 | -3.28 | 4.48 |
| 90.3309780587579 | 2.21 | 0.8 | -3.28 | 4.48 |
| 90.49832651543326 | 2.23 | 0.74 | -3.27 | 4.46 |
| 90.66567497210859 | 2.26 | 0.69 | -3.28 | 4.45 |
| 90.83302342878395 | 2.29 | 0.65 | -3.28 | 4.45 |
| 91.00037188545929 | 2.3 | 0.63 | -3.26 | 4.44 |
| 91.16772034213463 | 2.3 | 0.59 | -3.25 | 4.43 |
| 91.33506879880998 | 2.25 | 0.51 | -3.27 | 4.42 |
| 91.50241725548533 | 2.2 | 0.43 | -3.29 | 4.43 |
| 91.66976571216065 | 2.2 | 0.37 | -3.31 | 4.45 |
| 91.83711416883601 | 2.27 | 0.3 | -3.32 | 4.5 |
| 92.00446262551137 | 2.25 | 0.25 | -3.32 | 4.48 |
| 92.1718110821867 | 2.29 | 0.19 | -3.32 | 4.5 |
| 92.33915953886203 | 2.36 | 0.14 | -3.32 | 4.55 |
| 92.49721085905541 | 2.42 | 0.09 | -3.31 | 4.59 |
| 92.66455931573077 | 2.49 | 0.04 | -3.3 | 4.64 |
| 92.83190777240611 | 2.51 | -0.01 | -3.28 | 4.64 |
| 92.99925622908145 | 2.53 | -0.07 | -3.27 | 4.63 |
| 93.1666046857568 | 2.53 | -0.12 | -3.24 | 4.61 |
| 93.33395314243214 | 2.51 | -0.17 | -3.23 | 4.6 |
| 93.50130159910749 | 2.51 | -0.2 | -3.22 | 4.58 |
| 93.66865005578283 | 2.51 | -0.22 | -3.22 | 4.58 |
| 93.83599851245818 | 2.53 | -0.25 | -3.19 | 4.6 |
| 94.00334696913353 | 2.56 | -0.26 | -3.16 | 4.61 |
| 94.17069542580886 | 2.56 | -0.3 | -3.14 | 4.61 |
| 94.3380438824842 | 2.55 | -0.34 | -3.12 | 4.6 |
| 94.50539233915954 | 2.53 | -0.38 | -3.11 | 4.6 |
| 94.66344365935292 | 2.51 | -0.42 | -3.1 | 4.6 |
| 94.83079211602828 | 2.47 | -0.45 | -3.1 | 4.6 |
| 94.99814057270362 | 2.42 | -0.48 | -3.1 | 4.59 |
| 95.16548902937897 | 2.36 | -0.49 | -3.1 | 4.57 |
| 95.33283748605432 | 2.29 | -0.5 | -3.1 | 4.55 |
| 95.50018594272963 | 2.22 | -0.5 | -3.1 | 4.51 |
| 95.66753439940499 | 2.16 | -0.49 | -3.11 | 4.48 |
| 95.83488285608034 | 2.11 | -0.46 | -3.12 | 4.43 |
| 96.00223131275567 | 2.08 | -0.42 | -3.12 | 4.39 |
| 96.16957976943102 | 2.06 | -0.38 | -3.12 | 4.35 |
| 96.33692822610638 | 2.06 | -0.34 | -3.12 | 4.32 |
| 96.50427668278171 | 2.06 | -0.3 | -3.12 | 4.29 |
| 96.67162513945706 | 2.07 | -0.29 | -3.12 | 4.29 |
| 96.8389735961324 | 2.08 | -0.28 | -3.12 | 4.28 |
| 96.99702491632577 | 2.11 | -0.27 | -3.13 | 4.27 |
| 97.16437337300111 | 2.14 | -0.26 | -3.14 | 4.28 |
| 97.33172182967647 | 2.18 | -0.26 | -3.16 | 4.29 |
| 97.49907028635181 | 2.22 | -0.25 | -3.17 | 4.32 |
| 97.66641874302715 | 2.26 | -0.25 | -3.18 | 4.34 |
| 97.8337671997025 | 2.31 | -0.24 | -3.2 | 4.36 |
| 98.00111565637785 | 2.35 | -0.25 | -3.2 | 4.38 |
| 98.16846411305319 | 2.38 | -0.25 | -3.21 | 4.4 |
| 98.33581256972855 | 2.41 | -0.25 | -3.22 | 4.42 |
| 98.50316102640389 | 2.42 | -0.25 | -3.23 | 4.44 |
| 98.67050948307921 | 2.44 | -0.24 | -3.23 | 4.46 |
| 98.83785793975456 | 2.46 | -0.23 | -3.24 | 4.46 |
| 99.0052063964299 | 2.46 | -0.23 | -3.24 | 4.47 |
| 99.17255485310525 | 2.49 | -0.24 | -3.24 | 4.49 |
| 99.33060617329863 | 2.49 | -0.21 | -3.25 | 4.49 |
| 99.49795462997399 | 2.47 | -0.2 | -3.27 | 4.49 |
| 99.66530308664933 | 2.42 | -0.22 | -3.29 | 4.48 |
| 99.83265154332467 | 2.38 | -0.22 | -3.3 | 4.48 |
| 100.0 | 2.37 | -0.24 | -3.32 | 4.48 |